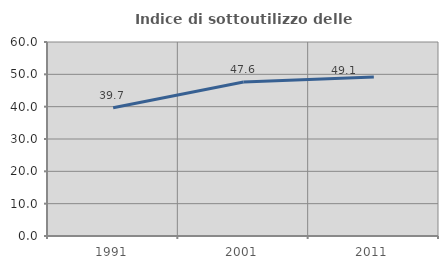
| Category | Indice di sottoutilizzo delle abitazioni  |
|---|---|
| 1991.0 | 39.669 |
| 2001.0 | 47.634 |
| 2011.0 | 49.148 |